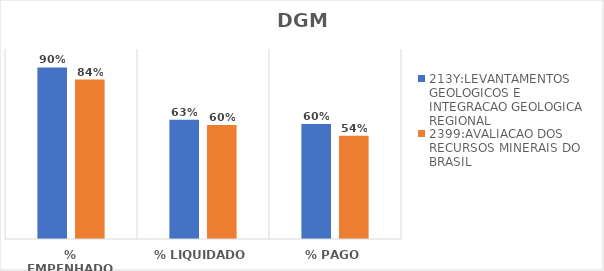
| Category | 213Y:LEVANTAMENTOS GEOLOGICOS E INTEGRACAO GEOLOGICA REGIONAL | 2399:AVALIACAO DOS RECURSOS MINERAIS DO BRASIL |
|---|---|---|
| % EMPENHADO | 0.903 | 0.839 |
| % LIQUIDADO | 0.627 | 0.6 |
| % PAGO | 0.605 | 0.544 |